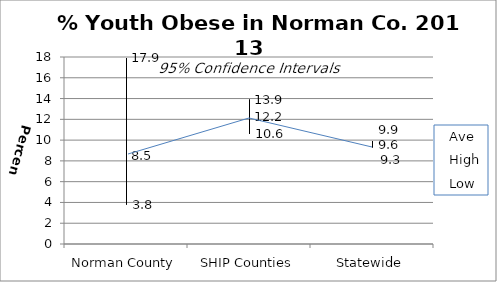
| Category | Ave | High | Low |
|---|---|---|---|
| Norman County | 8.5 | 17.9 | 3.8 |
| SHIP Counties | 12.2 | 13.9 | 10.6 |
| Statewide | 9.6 | 9.9 | 9.3 |